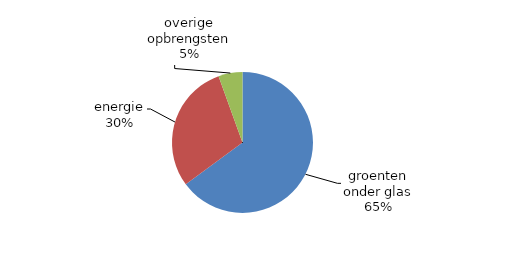
| Category | 2018* |
|---|---|
| groenten onder glas | 747233.723 |
| energie | 341020.623 |
| overige opbrengsten | 63490.274 |